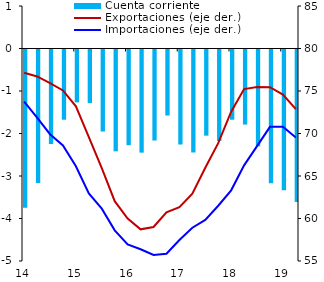
| Category | Cuenta corriente |
|---|---|
| 2014-03-01 | -3.726 |
| 2014-06-01 | -3.141 |
| 2014-09-01 | -2.225 |
| 2014-12-01 | -1.652 |
| 2015-03-01 | -1.243 |
| 2015-06-01 | -1.261 |
| 2015-09-01 | -1.93 |
| 2015-12-01 | -2.396 |
| 2016-03-01 | -2.251 |
| 2016-06-01 | -2.426 |
| 2016-09-01 | -2.141 |
| 2016-12-01 | -1.553 |
| 2017-03-01 | -2.236 |
| 2017-06-01 | -2.423 |
| 2017-09-01 | -2.027 |
| 2017-12-01 | -2.152 |
| 2018-03-01 | -1.652 |
| 2018-06-01 | -1.766 |
| 2018-09-01 | -2.279 |
| 2018-12-01 | -3.145 |
| 2019-03-01 | -3.311 |
| 2019-06-02 | -3.588 |